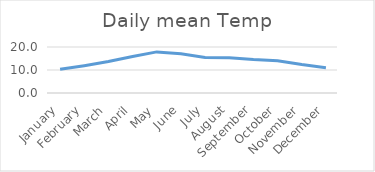
| Category | Series 0 |
|---|---|
| January | 10.287 |
| February | 11.893 |
| March | 13.657 |
| April | 15.89 |
| May | 17.873 |
| June | 17.037 |
| July | 15.463 |
| August | 15.317 |
| September | 14.513 |
| October | 14.053 |
| November | 12.347 |
| December | 10.963 |